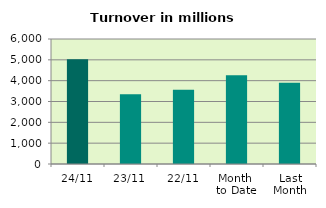
| Category | Series 0 |
|---|---|
| 24/11 | 5024.662 |
| 23/11 | 3344.573 |
| 22/11 | 3564.654 |
| Month 
to Date | 4259.69 |
| Last
Month | 3895.685 |